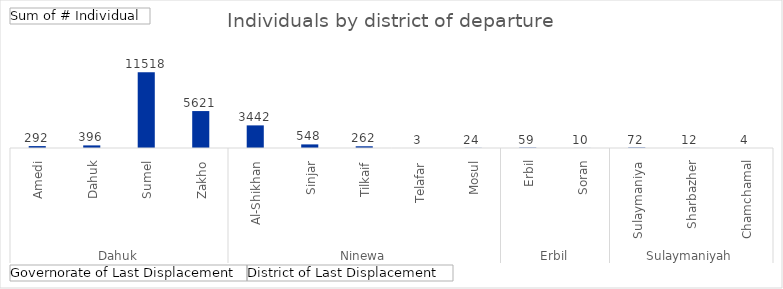
| Category | Total |
|---|---|
| 0 | 292 |
| 1 | 396 |
| 2 | 11518 |
| 3 | 5621 |
| 4 | 3442 |
| 5 | 548 |
| 6 | 262 |
| 7 | 3 |
| 8 | 24 |
| 9 | 59 |
| 10 | 10 |
| 11 | 72 |
| 12 | 12 |
| 13 | 4 |